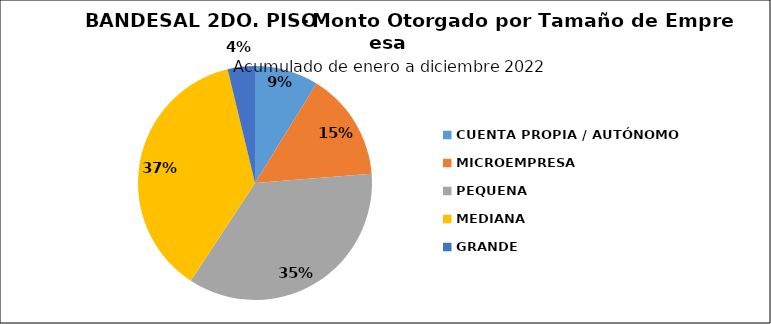
| Category | Monto | Créditos |
|---|---|---|
| CUENTA PROPIA / AUTÓNOMO | 20.128 | 1724 |
| MICROEMPRESA | 34.129 | 2185 |
| PEQUENA | 81.077 | 1545 |
| MEDIANA | 84.53 | 527 |
| GRANDE | 8.597 | 43 |